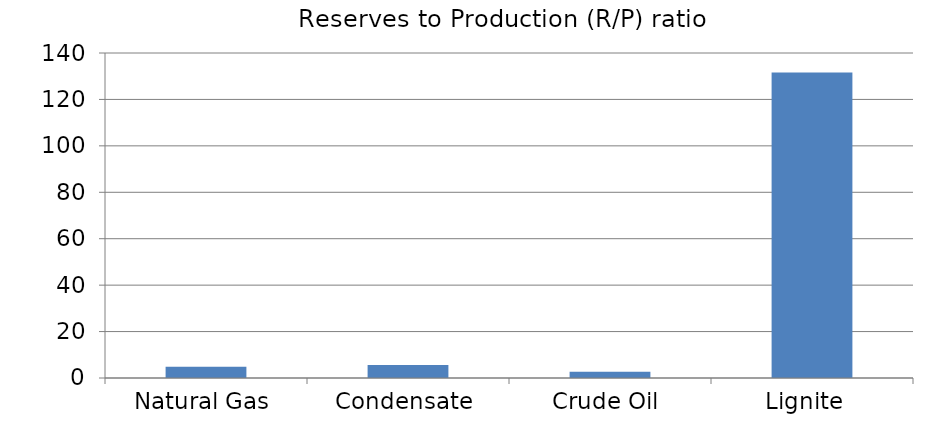
| Category | Reserves to Production (R/P) ratio |
|---|---|
| Natural Gas | 4.821 |
| Condensate | 5.581 |
| Crude Oil | 2.665 |
| Lignite  | 131.546 |